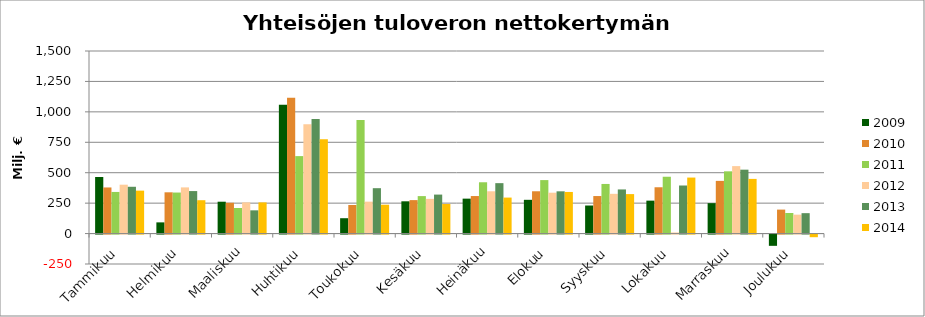
| Category | 2009 | 2010 | 2011 | 2012 | 2013 | 2014 |
|---|---|---|---|---|---|---|
| Tammikuu | 464.899 | 378.86 | 341.987 | 401.627 | 384.485 | 352.772 |
| Helmikuu | 92.021 | 339.045 | 337.078 | 379.401 | 349.199 | 274.106 |
| Maaliskuu | 261.783 | 253.057 | 210.203 | 256.28 | 190.945 | 256.156 |
| Huhtikuu | 1059.201 | 1115.624 | 636.437 | 897.203 | 940.935 | 774.228 |
| Toukokuu | 126.163 | 234.756 | 933.434 | 262.244 | 372.901 | 237.146 |
| Kesäkuu | 265.105 | 274.88 | 307.856 | 285.13 | 320.319 | 242.945 |
| Heinäkuu | 286.978 | 308.391 | 421.522 | 347.389 | 414.27 | 295.737 |
| Elokuu | 277.363 | 347.548 | 439.399 | 335.795 | 347.137 | 341.844 |
| Syyskuu | 230.468 | 308.333 | 407.65 | 326.578 | 362.569 | 324.323 |
| Lokakuu | 270.56 | 380.508 | 466.894 | 9.04 | 394.905 | 460.197 |
| Marraskuu | 249.968 | 432.891 | 511.438 | 554.296 | 524.993 | 449.175 |
| Joulukuu | -92.536 | 196.924 | 169.141 | 155.44 | 167.693 | -21.605 |